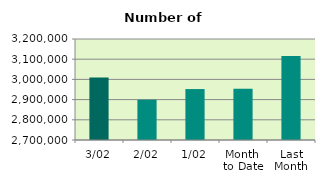
| Category | Series 0 |
|---|---|
| 3/02 | 3008804 |
| 2/02 | 2899426 |
| 1/02 | 2952204 |
| Month 
to Date | 2953478 |
| Last
Month | 3115708.381 |